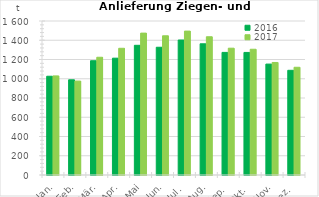
| Category | 2016 | 2017 |
|---|---|---|
| Jan. | 1026.032 | 1029.483 |
| Feb. | 989.225 | 975.814 |
| Mär. | 1187.296 | 1223.358 |
| Apr. | 1213.692 | 1316.509 |
| Mai | 1347.524 | 1474.136 |
| Jun. | 1327.192 | 1446.351 |
| Jul. | 1402.452 | 1495.105 |
| Aug. | 1363.045 | 1436.351 |
| Sep. | 1273.856 | 1317.397 |
| Okt. | 1273.461 | 1306.388 |
| Nov. | 1152.346 | 1169.041 |
| Dez. | 1087.801 | 1119.198 |